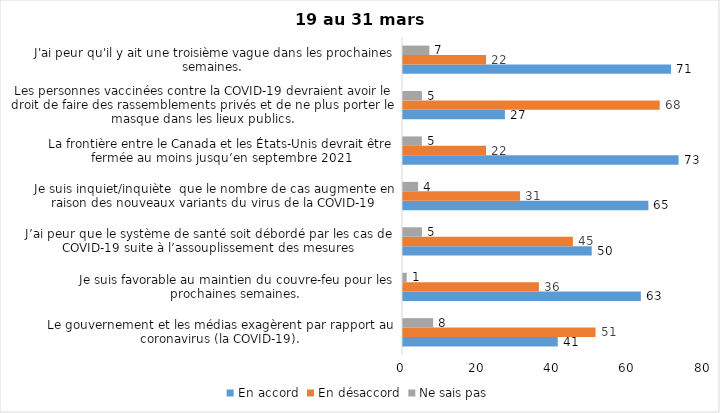
| Category | En accord | En désaccord | Ne sais pas |
|---|---|---|---|
| Le gouvernement et les médias exagèrent par rapport au coronavirus (la COVID-19). | 41 | 51 | 8 |
| Je suis favorable au maintien du couvre-feu pour les prochaines semaines. | 63 | 36 | 1 |
| J’ai peur que le système de santé soit débordé par les cas de COVID-19 suite à l’assouplissement des mesures | 50 | 45 | 5 |
| Je suis inquiet/inquiète  que le nombre de cas augmente en raison des nouveaux variants du virus de la COVID-19 | 65 | 31 | 4 |
| La frontière entre le Canada et les États-Unis devrait être fermée au moins jusqu’en septembre 2021 | 73 | 22 | 5 |
| Les personnes vaccinées contre la COVID-19 devraient avoir le droit de faire des rassemblements privés et de ne plus porter le masque dans les lieux publics. | 27 | 68 | 5 |
| J'ai peur qu'il y ait une troisième vague dans les prochaines semaines. | 71 | 22 | 7 |